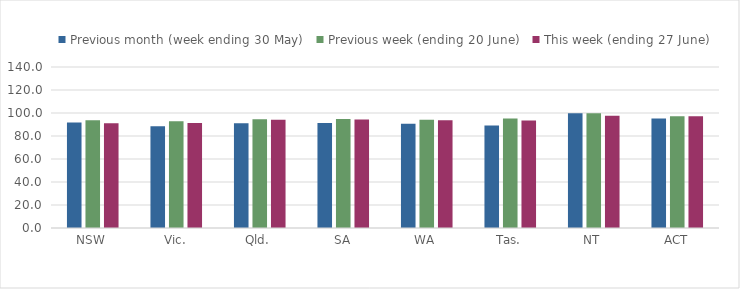
| Category | Previous month (week ending 30 May) | Previous week (ending 20 June) | This week (ending 27 June) |
|---|---|---|---|
| NSW | 91.801 | 93.619 | 91.141 |
| Vic. | 88.428 | 92.724 | 91.236 |
| Qld. | 91.092 | 94.648 | 94.103 |
| SA | 91.306 | 94.698 | 94.24 |
| WA | 90.576 | 94.167 | 93.654 |
| Tas. | 89.22 | 95.186 | 93.4 |
| NT | 99.742 | 99.742 | 97.527 |
| ACT | 95.286 | 97.236 | 97.091 |